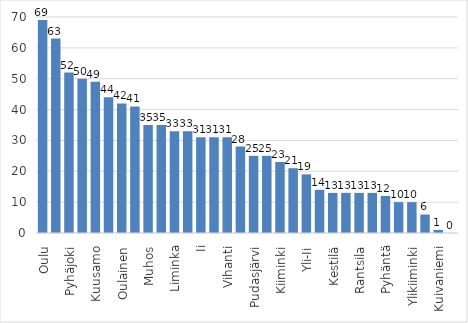
| Category | Series 0 |
|---|---|
| Oulu | 69 |
| Raahe | 63 |
| Pyhäjoki | 52 |
| Haukipudas | 50 |
| Kuusamo | 49 |
| Taivalkoski | 44 |
| Oulainen | 42 |
| Hailuoto | 41 |
| Muhos | 35 |
| Oulunsalo | 35 |
| Liminka | 33 |
| Lumijoki | 33 |
| Ii | 31 |
| Kempele | 31 |
| Vihanti | 31 |
| Ruukki | 28 |
| Pudasjärvi | 25 |
| Siikajoki | 25 |
| Kiiminki | 23 |
| Tyrnävä | 21 |
| Yli-Ii | 19 |
| Haapavesi | 14 |
| Kestilä | 13 |
| Merijärvi | 13 |
| Rantsila | 13 |
| Utajärvi | 13 |
| Pyhäntä | 12 |
| Pulkkila | 10 |
| Ylikiiminki | 10 |
| Piippola | 6 |
| Kuivaniemi | 1 |
| Kärsämäki | 0 |